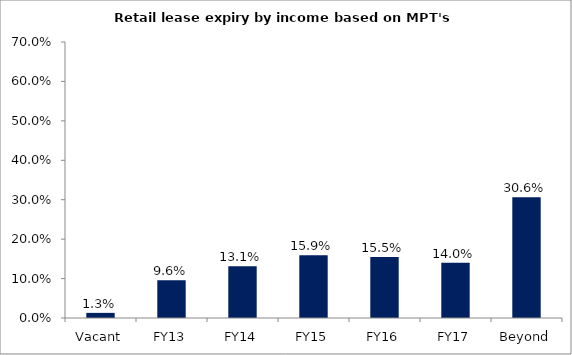
| Category | Series 0 |
|---|---|
| Vacant | 0.013 |
| FY13 | 0.096 |
| FY14 | 0.131 |
| FY15 | 0.159 |
| FY16 | 0.155 |
| FY17 | 0.14 |
| Beyond | 0.306 |